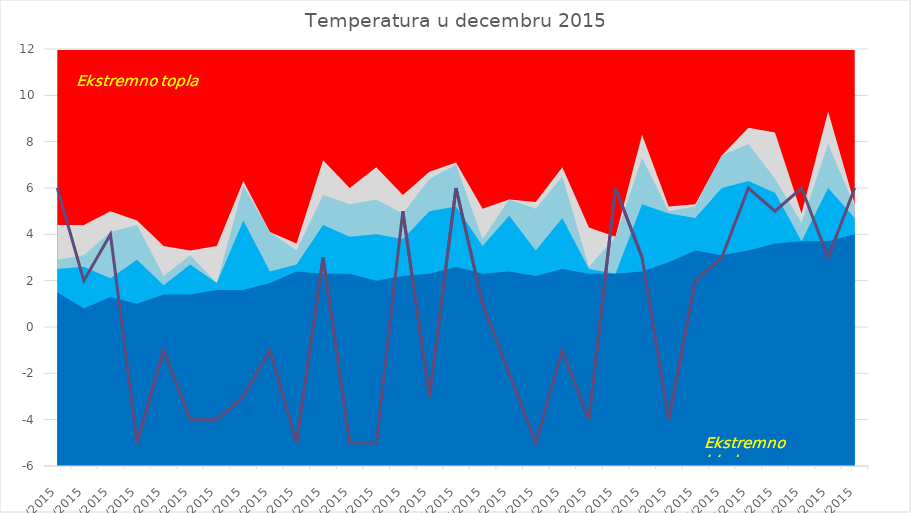
| Category | Temp |
|---|---|
| 42339.0 | 6 |
| 42340.0 | 2 |
| 42341.0 | 4 |
| 42342.0 | -5 |
| 42343.0 | -1 |
| 42344.0 | -4 |
| 42345.0 | -4 |
| 42346.0 | -3 |
| 42347.0 | -1 |
| 42348.0 | -5 |
| 42349.0 | 3 |
| 42350.0 | -5 |
| 42351.0 | -5 |
| 42352.0 | 5 |
| 42353.0 | -3 |
| 42354.0 | 6 |
| 42355.0 | 1 |
| 42356.0 | -2 |
| 42357.0 | -5 |
| 42358.0 | -1 |
| 42359.0 | -4 |
| 42360.0 | 6 |
| 42361.0 | 3 |
| 42362.0 | -4 |
| 42363.0 | 2 |
| 42364.0 | 3 |
| 42365.0 | 6 |
| 42366.0 | 5 |
| 42367.0 | 6 |
| 42368.0 | 3 |
| 42369.0 | 6 |